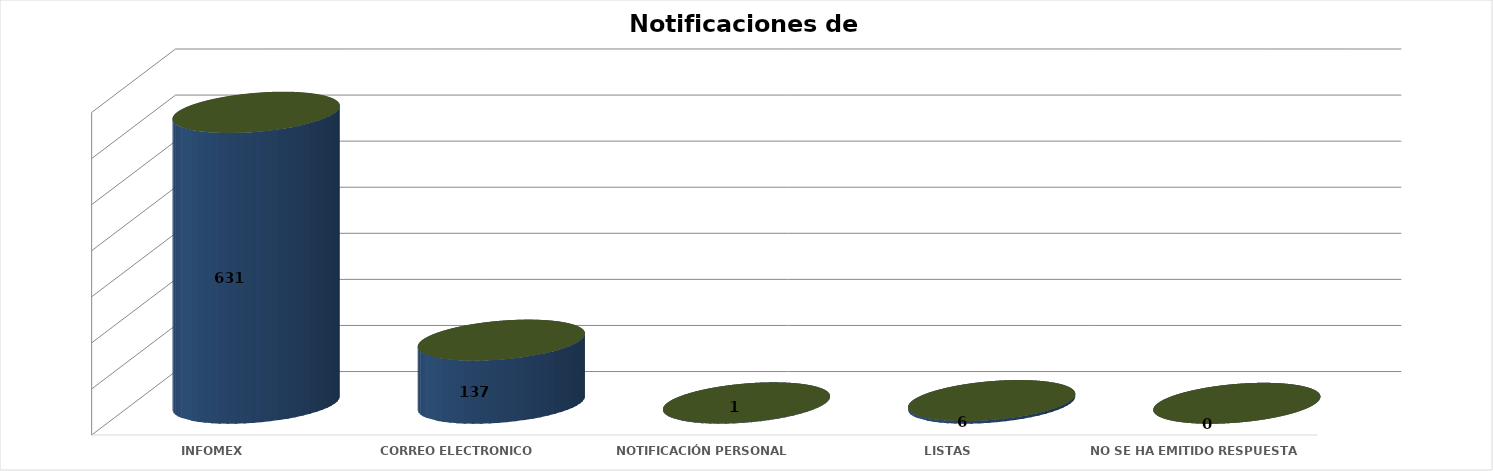
| Category | Series 0 | Series 1 | Series 2 | Series 3 | Series 4 |
|---|---|---|---|---|---|
| INFOMEX |  |  |  | 631 | 0.814 |
| CORREO ELECTRONICO |  |  |  | 137 | 0.177 |
| NOTIFICACIÓN PERSONAL |  |  |  | 1 | 0.001 |
| LISTAS |  |  |  | 6 | 0.008 |
|  NO SE HA EMITIDO RESPUESTA |  |  |  | 0 | 0 |